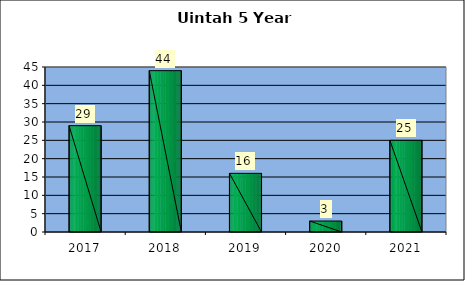
| Category | Washington Terrace March 5 Year Comparison |
|---|---|
| 0 | 29 |
| 1 | 44 |
| 2 | 16 |
| 3 | 3 |
| 4 | 25 |